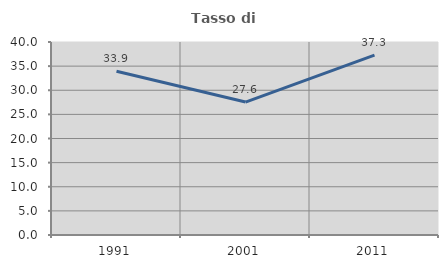
| Category | Tasso di occupazione   |
|---|---|
| 1991.0 | 33.929 |
| 2001.0 | 27.551 |
| 2011.0 | 37.278 |